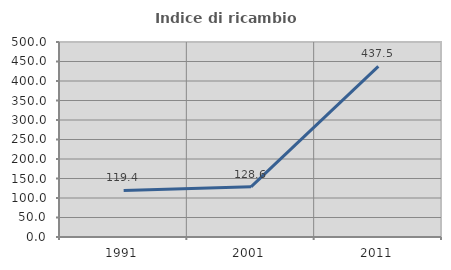
| Category | Indice di ricambio occupazionale  |
|---|---|
| 1991.0 | 119.444 |
| 2001.0 | 128.571 |
| 2011.0 | 437.5 |